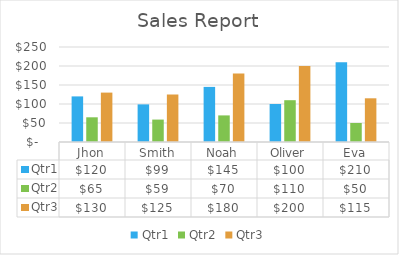
| Category | Qtr1 | Qtr2 | Qtr3 |
|---|---|---|---|
| Jhon | 120 | 65 | 130 |
| Smith | 99 | 59 | 125 |
| Noah | 145 | 70 | 180 |
| Oliver | 100 | 110 | 200 |
| Eva | 210 | 50 | 115 |